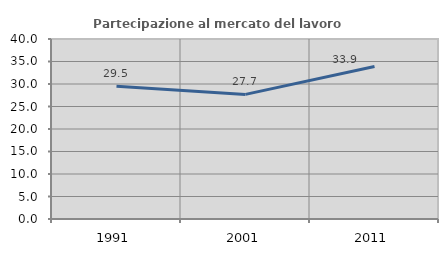
| Category | Partecipazione al mercato del lavoro  femminile |
|---|---|
| 1991.0 | 29.508 |
| 2001.0 | 27.692 |
| 2011.0 | 33.898 |